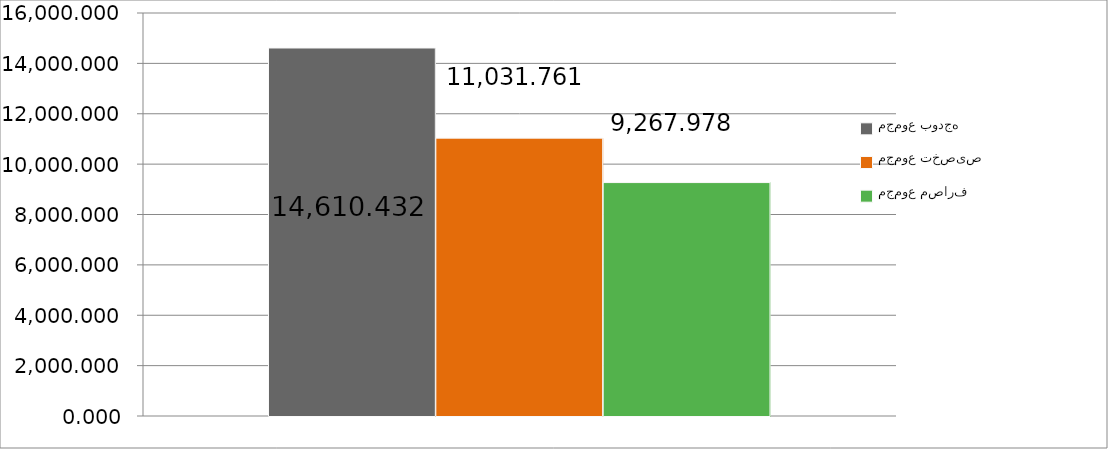
| Category | مجموع بودجه  | مجموع تخصیص | مجموع مصارف |
|---|---|---|---|
| 0 | 14610.432 | 11031.761 | 9267.978 |